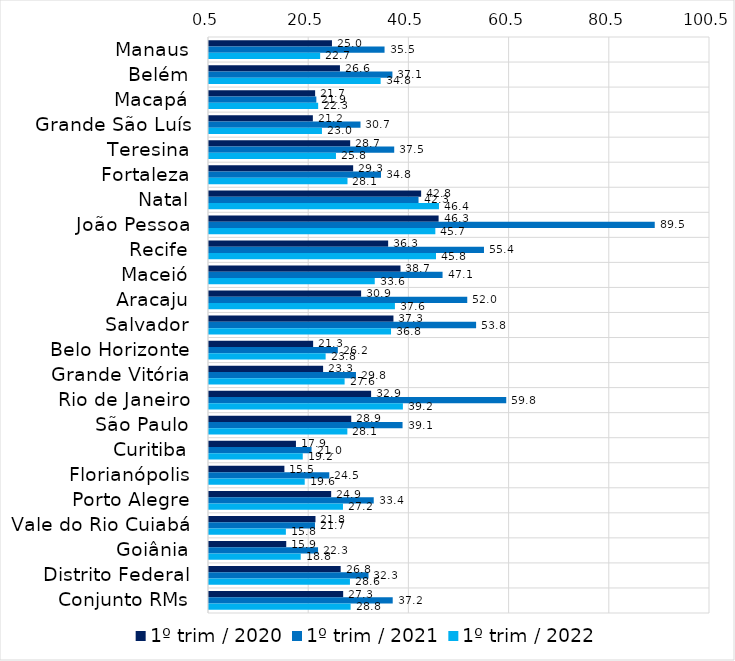
| Category | 1º trim / 2020 | 1º trim / 2021 | 1º trim / 2022 |
|---|---|---|---|
| Manaus | 25.042 | 35.541 | 22.689 |
| Belém | 26.638 | 37.11 | 34.759 |
| Macapá | 21.684 | 21.927 | 22.289 |
| Grande São Luís | 21.231 | 30.738 | 23.046 |
| Teresina | 28.68 | 37.469 | 25.842 |
| Fortaleza | 29.275 | 34.832 | 28.144 |
| Natal | 42.842 | 42.324 | 46.403 |
| João Pessoa | 46.33 | 89.471 | 45.677 |
| Recife | 36.258 | 55.386 | 45.81 |
| Maceió | 38.723 | 47.119 | 33.584 |
| Aracaju | 30.863 | 52.048 | 37.61 |
| Salvador | 37.316 | 53.816 | 36.836 |
| Belo Horizonte | 21.286 | 26.212 | 23.78 |
| Grande Vitória | 23.276 | 29.835 | 27.567 |
| Rio de Janeiro | 32.857 | 59.83 | 39.201 |
| São Paulo | 28.895 | 39.133 | 28.115 |
| Curitiba | 17.856 | 20.975 | 19.215 |
| Florianópolis | 15.549 | 24.51 | 19.605 |
| Porto Alegre | 24.886 | 33.381 | 27.242 |
| Vale do Rio Cuiabá | 21.752 | 21.656 | 15.845 |
| Goiânia | 15.917 | 22.269 | 18.806 |
| Distrito Federal | 26.781 | 32.336 | 28.632 |
| Conjunto RMs | 27.281 | 37.17 | 28.765 |